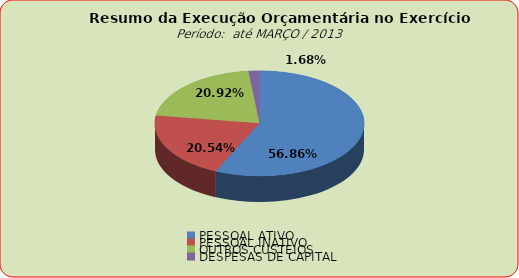
| Category | Series 0 |
|---|---|
| PESSOAL ATIVO | 24209803.96 |
| PESSOAL INATIVO | 8746795.23 |
| OUTROS CUSTEIOS | 8907942.64 |
| DESPESAS DE CAPITAL | 714446.06 |